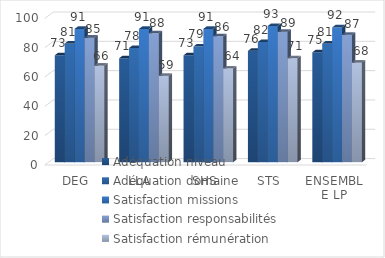
| Category | Adéquation niveau | Adéquation domaine | Satisfaction missions | Satisfaction responsabilités | Satisfaction rémunération |
|---|---|---|---|---|---|
| DEG | 73 | 81 | 91 | 85 | 66 |
| LLA | 71 | 78 | 91 | 88 | 59 |
| SHS | 73 | 79 | 91 | 86 | 64 |
| STS | 76 | 82 | 93 | 89 | 71 |
| ENSEMBLE LP | 75 | 81 | 92 | 87 | 68 |